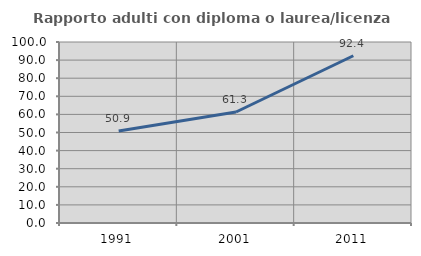
| Category | Rapporto adulti con diploma o laurea/licenza media  |
|---|---|
| 1991.0 | 50.864 |
| 2001.0 | 61.333 |
| 2011.0 | 92.414 |